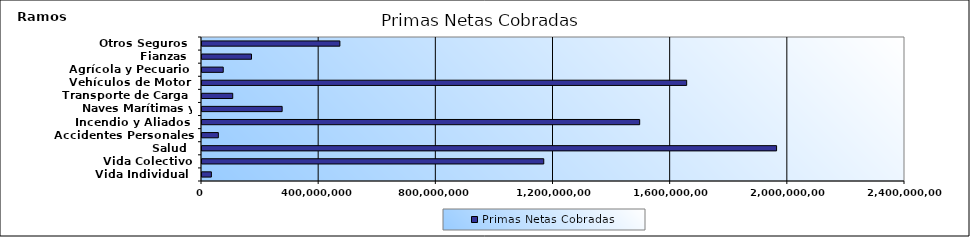
| Category | Primas Netas Cobradas |
|---|---|
| Vida Individual  | 32012741.04 |
| Vida Colectivo | 1166718862.15 |
| Salud  | 1961578435.78 |
| Accidentes Personales | 55824488.47 |
| Incendio y Aliados  | 1494199874.06 |
| Naves Marítimas y Aéreas  | 273608839.41 |
| Transporte de Carga  | 104890147.59 |
| Vehículos de Motor  | 1654683358.87 |
| Agrícola y Pecuario  | 72522520.38 |
| Fianzas  | 169007987.82 |
| Otros Seguros  | 470731325.31 |